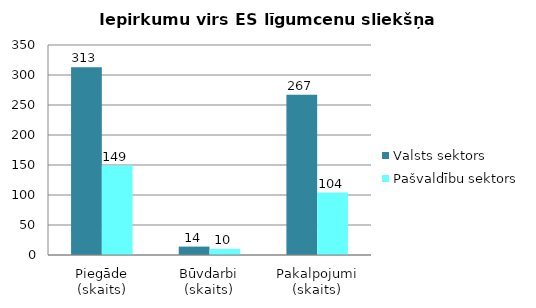
| Category | Valsts sektors | Pašvaldību sektors |
|---|---|---|
| Piegāde (skaits) | 313 | 149 |
| Būvdarbi (skaits) | 14 | 10 |
| Pakalpojumi (skaits) | 267 | 104 |